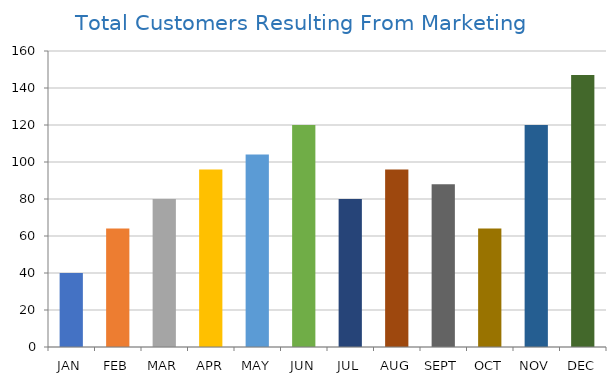
| Category | Total |
|---|---|
| JAN | 40 |
| FEB | 64 |
| MAR | 80 |
| APR | 96 |
| MAY | 104 |
| JUN | 120 |
| JUL | 80 |
| AUG | 96 |
| SEPT | 88 |
| OCT | 64 |
| NOV | 120 |
| DEC | 147 |